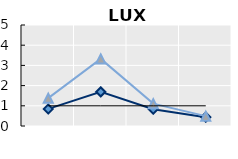
| Category | Public goods | Individual items only | Series 1 |
|---|---|---|---|
| 15-24 | 0.845 | 1.379 | 1 |
| 25-54 | 1.688 | 3.322 | 1 |
| 55-64 | 0.827 | 1.107 | 1 |
| 65+ | 0.439 | 0.488 | 1 |